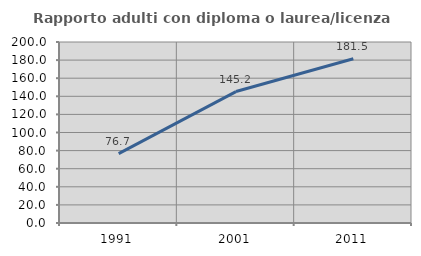
| Category | Rapporto adulti con diploma o laurea/licenza media  |
|---|---|
| 1991.0 | 76.688 |
| 2001.0 | 145.247 |
| 2011.0 | 181.488 |